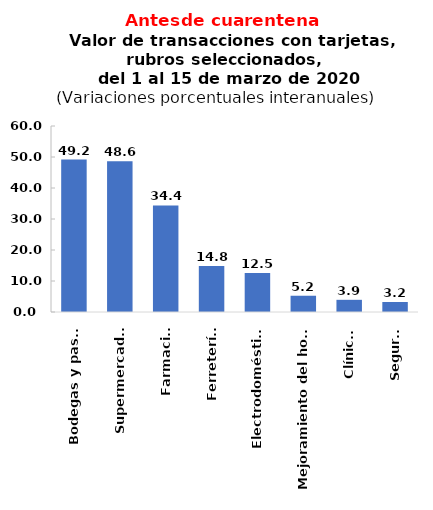
| Category | Var.%  |
|---|---|
| Bodegas y pastas | 49.184 |
| Supermercados | 48.607 |
| Farmacias | 34.362 |
| Ferreterías | 14.827 |
| Electrodomésticos | 12.55 |
| Mejoramiento del hogar | 5.245 |
| Clínicas | 3.931 |
| Seguros | 3.233 |